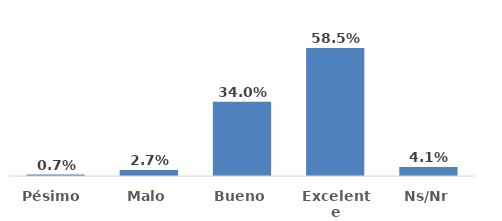
| Category | Series 0 |
|---|---|
| Pésimo  | 0.007 |
| Malo | 0.027 |
| Bueno | 0.34 |
| Excelente | 0.585 |
| Ns/Nr | 0.041 |